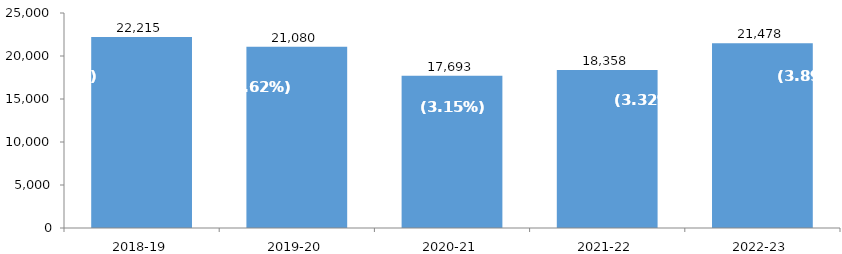
| Category | Homeless Students* |
|---|---|
| 2018-19 | 22215 |
| 2019-20 | 21080 |
| 2020-21 | 17693 |
| 2021-22 | 18358 |
| 2022-23 | 21478 |